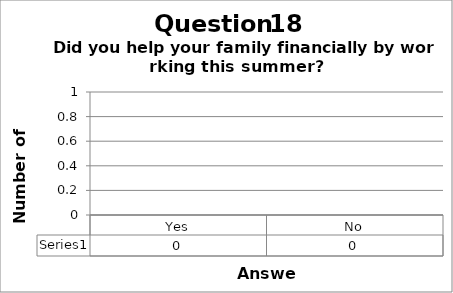
| Category | Series 0 |
|---|---|
| Yes | 0 |
| No | 0 |